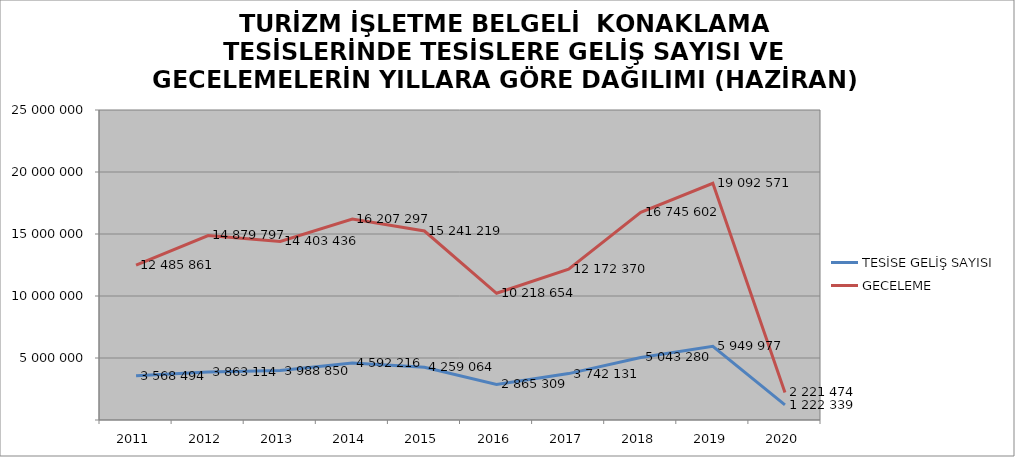
| Category | TESİSE GELİŞ SAYISI | GECELEME |
|---|---|---|
| 2011 | 3568494 | 12485861 |
| 2012 | 3863114 | 14879797 |
| 2013 | 3988850 | 14403436 |
| 2014 | 4592216 | 16207297 |
| 2015 | 4259064 | 15241219 |
| 2016 | 2865309 | 10218654 |
| 2017 | 3742131 | 12172370 |
| 2018 | 5043280 | 16745602 |
| 2019 | 5949977 | 19092571 |
| 2020 | 1222339 | 2221474 |